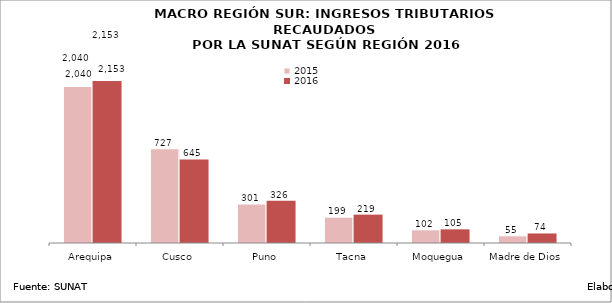
| Category | 2015 | 2016 |
|---|---|---|
| Arequipa | 2039.993 | 2153.066 |
| Cusco | 727.219 | 645.038 |
| Puno | 300.66 | 325.99 |
| Tacna | 199.448 | 218.94 |
| Moquegua | 101.581 | 105.387 |
| Madre de Dios | 55.442 | 73.527 |